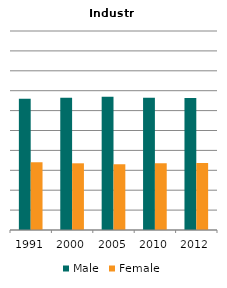
| Category | Male | Female |
|---|---|---|
| 1991.0 | 0.66 | 0.34 |
| 2000.0 | 0.665 | 0.335 |
| 2005.0 | 0.67 | 0.33 |
| 2010.0 | 0.665 | 0.335 |
| 2012.0 | 0.663 | 0.337 |